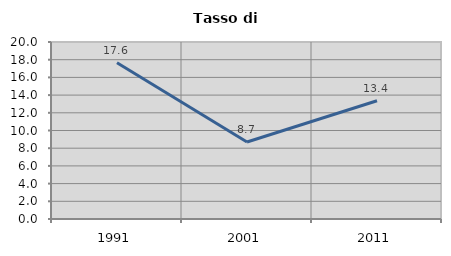
| Category | Tasso di disoccupazione   |
|---|---|
| 1991.0 | 17.647 |
| 2001.0 | 8.696 |
| 2011.0 | 13.359 |